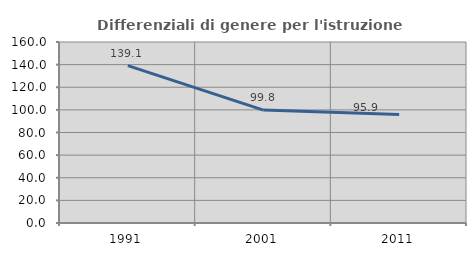
| Category | Differenziali di genere per l'istruzione superiore |
|---|---|
| 1991.0 | 139.118 |
| 2001.0 | 99.822 |
| 2011.0 | 95.895 |